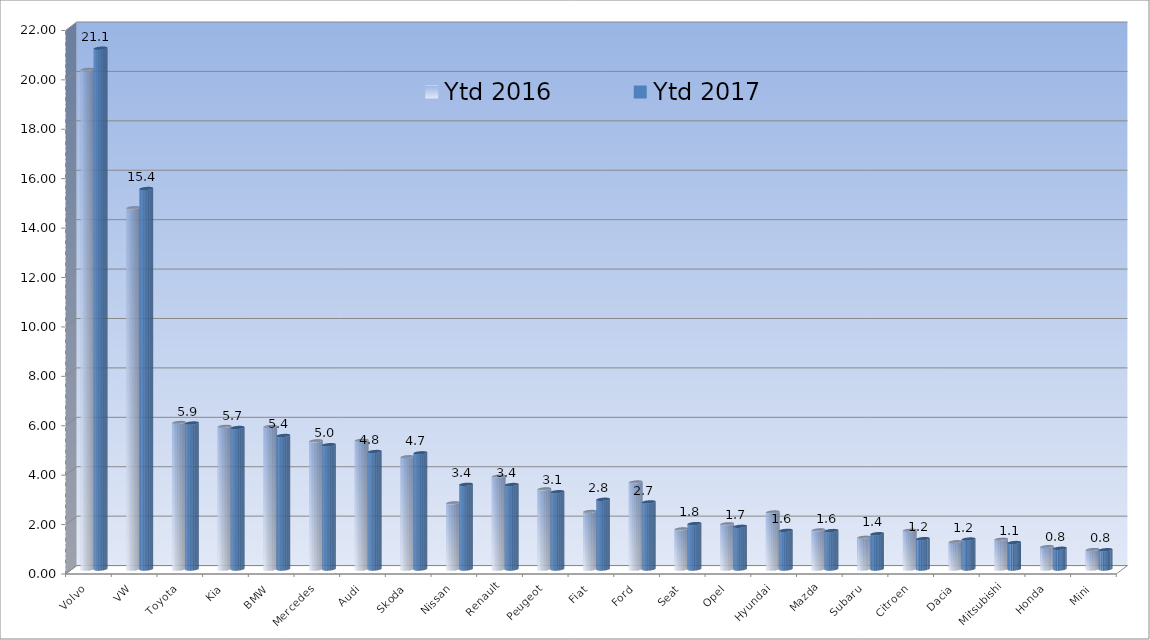
| Category | Ytd 2016 | Ytd 2017 |
|---|---|---|
| Volvo | 20.218 | 21.079 |
| VW | 14.618 | 15.401 |
| Toyota | 5.93 | 5.908 |
| Kia | 5.773 | 5.727 |
| BMW | 5.765 | 5.404 |
| Mercedes | 5.184 | 5.031 |
| Audi | 5.21 | 4.755 |
| Skoda | 4.541 | 4.703 |
| Nissan | 2.674 | 3.427 |
| Renault | 3.757 | 3.419 |
| Peugeot | 3.241 | 3.128 |
| Fiat | 2.327 | 2.822 |
| Ford | 3.52 | 2.716 |
| Seat | 1.621 | 1.838 |
| Opel | 1.828 | 1.728 |
| Hyundai | 2.306 | 1.563 |
| Mazda | 1.58 | 1.556 |
| Subaru | 1.285 | 1.427 |
| Citroen | 1.57 | 1.228 |
| Dacia | 1.101 | 1.213 |
| Mitsubishi | 1.203 | 1.071 |
| Honda | 0.902 | 0.839 |
| Mini | 0.786 | 0.781 |